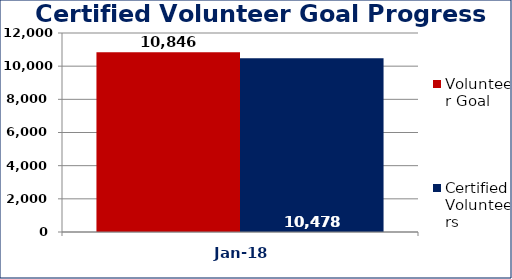
| Category | Volunteer Goal  | Certified Volunteers  |
|---|---|---|
| Jan-18 | 10846 | 10478 |